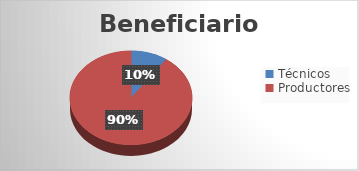
| Category | Series 0 |
|---|---|
| Técnicos | 3 |
| Productores | 28 |